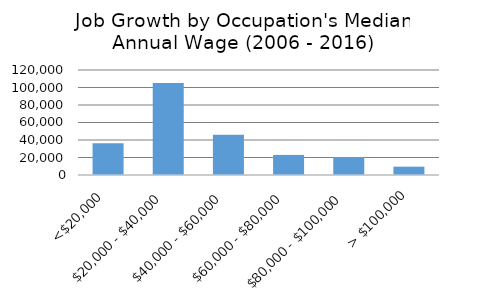
| Category | Series 0 |
|---|---|
| <$20,000 | 36293 |
| $20,000 - $40,000 | 105143 |
| $40,000 - $60,000 | 45962 |
| $60,000 - $80,000 | 22933 |
| $80,000 - $100,000 | 20556 |
| > $100,000 | 9527 |